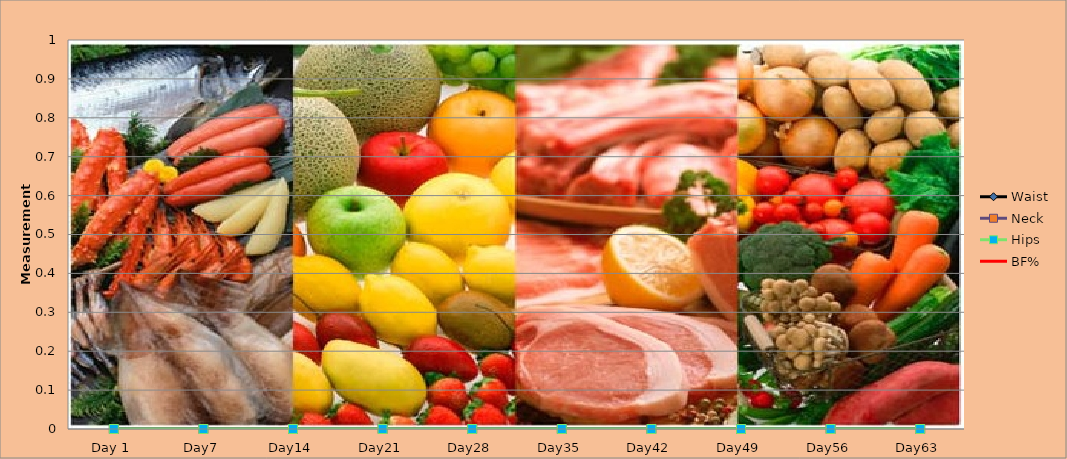
| Category | Waist | Neck | Hips | BF% |
|---|---|---|---|---|
| 0 | 0 | 0 | 0 | 0 |
| 1 | 0 | 0 | 0 | 0 |
| 2 | 0 | 0 | 0 | 0 |
| 3 | 0 | 0 | 0 | 0 |
| 4 | 0 | 0 | 0 | 0 |
| 5 | 0 | 0 | 0 | 0 |
| 6 | 0 | 0 | 0 | 0 |
| 7 | 0 | 0 | 0 | 0 |
| 8 | 0 | 0 | 0 | 0 |
| 9 | 0 | 0 | 0 | 0 |